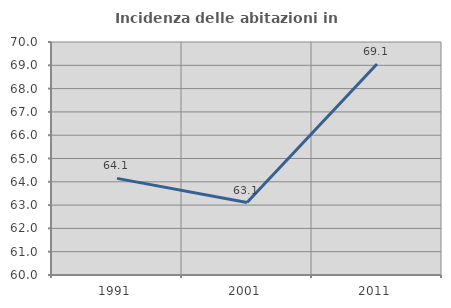
| Category | Incidenza delle abitazioni in proprietà  |
|---|---|
| 1991.0 | 64.147 |
| 2001.0 | 63.109 |
| 2011.0 | 69.052 |